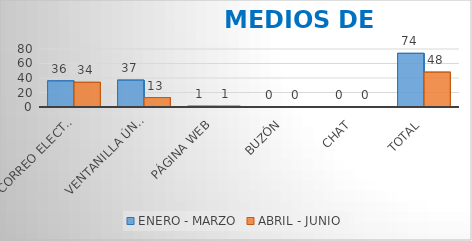
| Category | ENERO - MARZO | ABRIL - JUNIO |
|---|---|---|
| CORREO ELECTRÓNICO | 36 | 34 |
| VENTANILLA ÚNICA | 37 | 13 |
| PÁGINA WEB | 1 | 1 |
| BUZÓN | 0 | 0 |
| CHAT | 0 | 0 |
| TOTAL | 74 | 48 |